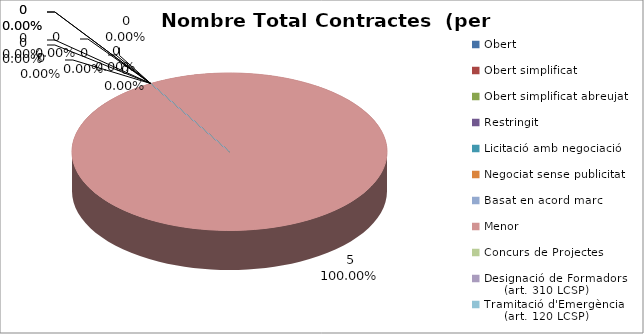
| Category | Nombre Total Contractes |
|---|---|
| Obert | 0 |
| Obert simplificat | 0 |
| Obert simplificat abreujat | 0 |
| Restringit | 0 |
| Licitació amb negociació | 0 |
| Negociat sense publicitat | 0 |
| Basat en acord marc | 0 |
| Menor | 5 |
| Concurs de Projectes | 0 |
| Designació de Formadors
     (art. 310 LCSP) | 0 |
| Tramitació d'Emergència
     (art. 120 LCSP) | 0 |